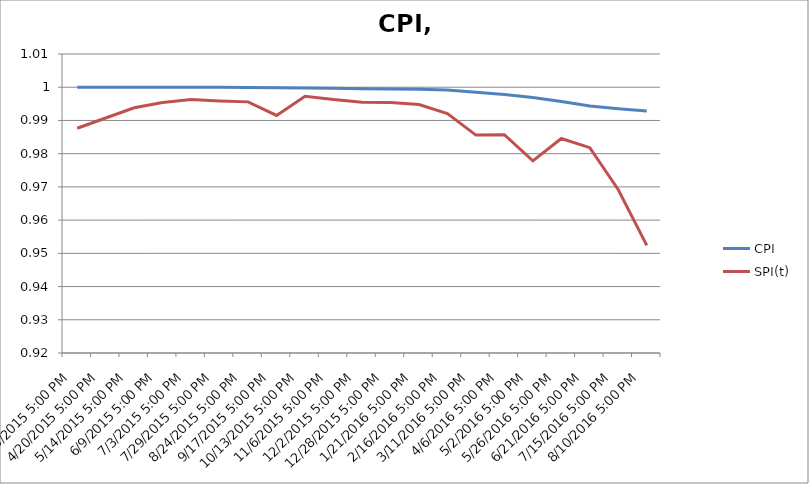
| Category | CPI | SPI(t) |
|---|---|---|
| 3/25/2015 5:00 PM | 1 | 0.988 |
| 4/20/2015 5:00 PM | 1 | 0.991 |
| 5/14/2015 5:00 PM | 1 | 0.994 |
| 6/9/2015 5:00 PM | 1 | 0.995 |
| 7/3/2015 5:00 PM | 1 | 0.996 |
| 7/29/2015 5:00 PM | 1 | 0.996 |
| 8/24/2015 5:00 PM | 1 | 0.996 |
| 9/17/2015 5:00 PM | 1 | 0.992 |
| 10/13/2015 5:00 PM | 1 | 0.997 |
| 11/6/2015 5:00 PM | 1 | 0.996 |
| 12/2/2015 5:00 PM | 1 | 0.996 |
| 12/28/2015 5:00 PM | 0.999 | 0.995 |
| 1/21/2016 5:00 PM | 0.999 | 0.995 |
| 2/16/2016 5:00 PM | 0.999 | 0.992 |
| 3/11/2016 5:00 PM | 0.999 | 0.986 |
| 4/6/2016 5:00 PM | 0.998 | 0.986 |
| 5/2/2016 5:00 PM | 0.997 | 0.978 |
| 5/26/2016 5:00 PM | 0.996 | 0.985 |
| 6/21/2016 5:00 PM | 0.994 | 0.982 |
| 7/15/2016 5:00 PM | 0.994 | 0.969 |
| 8/10/2016 5:00 PM | 0.993 | 0.952 |